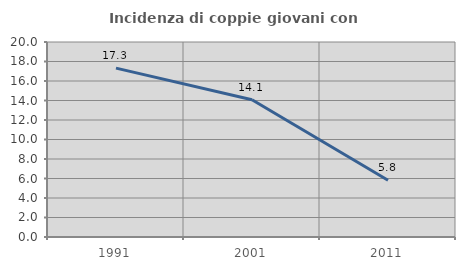
| Category | Incidenza di coppie giovani con figli |
|---|---|
| 1991.0 | 17.323 |
| 2001.0 | 14.074 |
| 2011.0 | 5.825 |